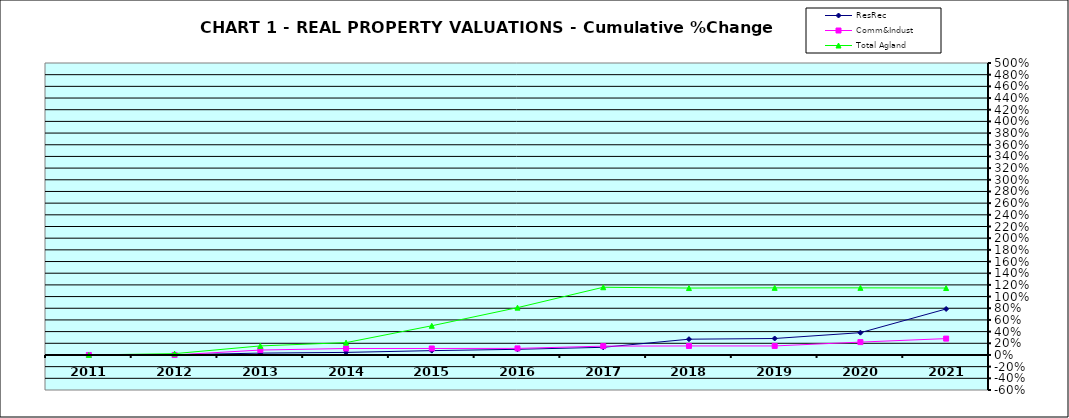
| Category | ResRec | Comm&Indust | Total Agland |
|---|---|---|---|
| 2011.0 | 0 | 0 | 0 |
| 2012.0 | 0.003 | 0 | 0.023 |
| 2013.0 | 0.032 | 0.084 | 0.155 |
| 2014.0 | 0.044 | 0.111 | 0.211 |
| 2015.0 | 0.074 | 0.111 | 0.5 |
| 2016.0 | 0.097 | 0.113 | 0.811 |
| 2017.0 | 0.131 | 0.151 | 1.16 |
| 2018.0 | 0.27 | 0.155 | 1.146 |
| 2019.0 | 0.282 | 0.155 | 1.149 |
| 2020.0 | 0.382 | 0.22 | 1.149 |
| 2021.0 | 0.788 | 0.28 | 1.146 |